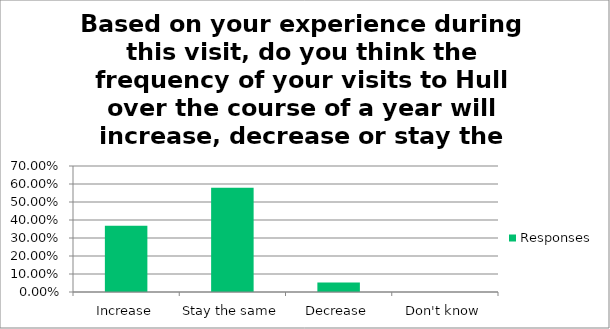
| Category | Responses |
|---|---|
| Increase | 0.368 |
| Stay the same | 0.579 |
| Decrease | 0.053 |
| Don't know | 0 |